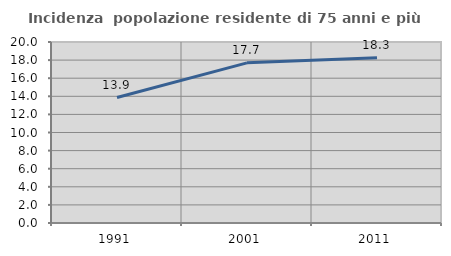
| Category | Incidenza  popolazione residente di 75 anni e più |
|---|---|
| 1991.0 | 13.861 |
| 2001.0 | 17.699 |
| 2011.0 | 18.255 |